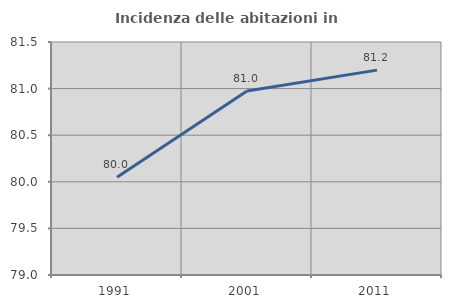
| Category | Incidenza delle abitazioni in proprietà  |
|---|---|
| 1991.0 | 80.048 |
| 2001.0 | 80.974 |
| 2011.0 | 81.198 |